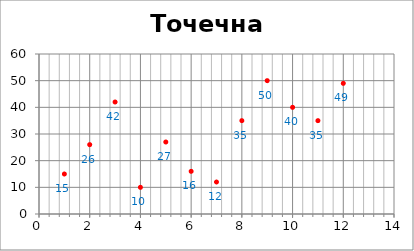
| Category | Точечная |
|---|---|
| 0 | 15 |
| 1 | 26 |
| 2 | 42 |
| 3 | 10 |
| 4 | 27 |
| 5 | 16 |
| 6 | 12 |
| 7 | 35 |
| 8 | 50 |
| 9 | 40 |
| 10 | 35 |
| 11 | 49 |